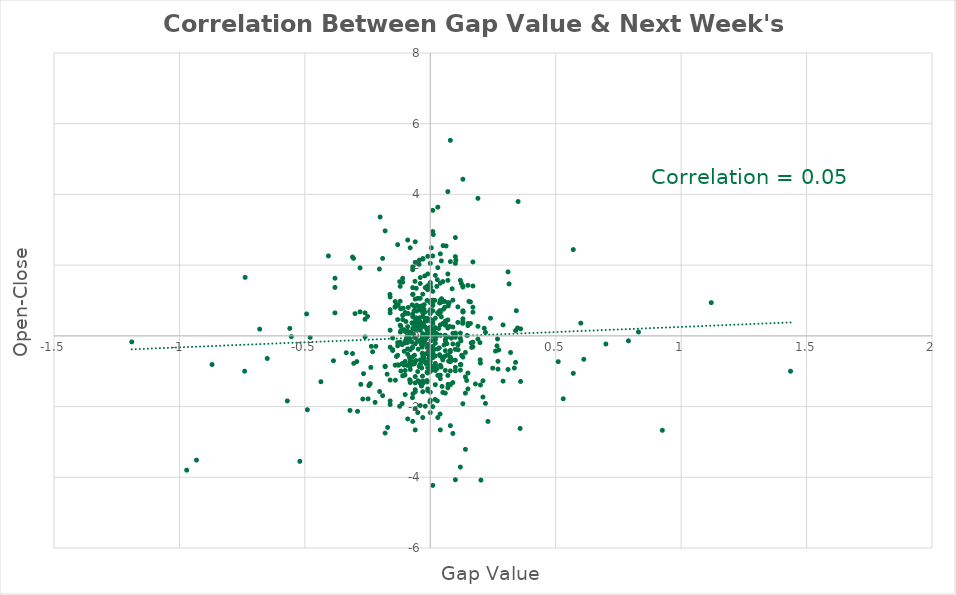
| Category | Series 0 |
|---|---|
| -0.0480000000000018 | -0.377 |
| -0.0409999999999968 | -0.809 |
| -0.0229999999999961 | -0.082 |
| -0.0309999999999917 | -0.235 |
| 0.00499999999999545 | 0.15 |
| -0.0999999999999943 | -0.158 |
| -0.0349999999999965 | -0.226 |
| 0.0289999999999963 | 0.652 |
| -0.00399999999999067 | -0.57 |
| -0.088000000000008 | 0.803 |
| -0.0630000000000023 | -0.548 |
| 0.0240000000000009 | 0.07 |
| -0.0240000000000009 | 0.884 |
| -0.0100000000000051 | -0.243 |
| 0.0369999999999919 | -0.532 |
| -0.0290000000000105 | -0.582 |
| 0.00300000000000011 | -0.136 |
| -0.0390000000000014 | 0.26 |
| -0.034000000000006 | -0.909 |
| -0.0609999999999928 | 0.336 |
| -0.0169999999999959 | -0.786 |
| -0.0649999999999977 | 0.702 |
| 0.0470000000000112 | -1.43 |
| -0.054000000000002 | 0.866 |
| -0.0430000000000063 | 0.833 |
| 0.0570000000000021 | 0.975 |
| 0.0429999999999921 | -0.88 |
| -0.265999999999991 | -1.069 |
| -0.012999999999991 | 0.163 |
| -0.0570000000000021 | -0.699 |
| -0.00100000000000477 | -1.87 |
| -0.0310000000000059 | -1.138 |
| -0.0170000000000101 | -0.504 |
| -0.0580000000000069 | 0.382 |
| 0.054000000000002 | -0.597 |
| 0.027000000000001 | -0.927 |
| -0.066999999999993 | 0.042 |
| -0.0930000000000035 | -0.011 |
| -0.112000000000009 | -0.784 |
| -0.117000000000004 | 0.272 |
| 0.197999999999993 | -0.191 |
| -0.0879999999999938 | 0.633 |
| -0.0769999999999981 | 0.1 |
| -0.0489999999999923 | -0.149 |
| -0.0339999999999918 | -0.272 |
| 0.0720000000000027 | 0.848 |
| -0.0419999999999873 | -1.303 |
| -0.161000000000001 | 1.171 |
| -0.0210000000000008 | -0.014 |
| -0.0219999999999913 | 0.669 |
| 0.129000000000004 | 0.353 |
| -0.0720000000000027 | -0.336 |
| -0.0580000000000069 | 0.163 |
| -0.100999999999999 | -1.109 |
| -0.061000000000007 | 1.542 |
| -0.0120000000000004 | 0.057 |
| -0.11699999999999 | -0.995 |
| -0.0409999999999968 | 0.406 |
| -0.0249999999999914 | 0.754 |
| -0.0670000000000072 | -0.735 |
| -0.11999999999999 | -0.181 |
| -0.105000000000004 | 0.174 |
| 0.0370000000000061 | 0.931 |
| -0.0730000000000075 | -0.179 |
| -0.0429999999999921 | 0.512 |
| -0.149999999999991 | -0.415 |
| -0.103999999999999 | -0.438 |
| -0.0970000000000084 | 0.406 |
| -0.0289999999999963 | 2.186 |
| -0.111999999999994 | -1.914 |
| -0.0600000000000022 | -0.227 |
| -0.0289999999999963 | -0.555 |
| -0.135000000000005 | -0.584 |
| -0.117000000000004 | 0.147 |
| 0.131 | 0.681 |
| -0.0879999999999938 | -0.025 |
| -0.0330000000000012 | 0.85 |
| -0.0150000000000005 | -0.057 |
| -0.293000000000006 | -0.728 |
| 0.0120000000000004 | 2.865 |
| -0.971000000000003 | -3.799 |
| -0.932000000000002 | -3.514 |
| -0.406000000000005 | 2.26 |
| -0.200000000000002 | 3.362 |
| 0.0190000000000054 | -1.8 |
| -0.0959999999999894 | -0.099 |
| 0.0709999999999979 | -1.371 |
| -0.300000000000011 | 0.629 |
| -0.0619999999999976 | 0.818 |
| 0.0480000000000018 | -0.625 |
| -0.201999999999998 | -1.574 |
| -0.0120000000000004 | 1.317 |
| -0.0279999999999915 | -0.007 |
| -0.0910000000000081 | -0.187 |
| 0.0729999999999932 | -0.715 |
| 0.0439999999999969 | 0.957 |
| -0.0439999999999969 | -0.869 |
| 0.01400000000001 | 0.132 |
| -0.0150000000000005 | 0.433 |
| 0.059999999999988 | -0.978 |
| 0.0439999999999969 | 0.539 |
| 0.0660000000000025 | -0.22 |
| -0.0909999999999939 | -0.029 |
| -0.248000000000004 | -1.781 |
| 0.0450000000000017 | 1.05 |
| 0.162999999999996 | -0.199 |
| -0.554000000000002 | -0.023 |
| -0.0800000000000125 | -1.266 |
| -0.236999999999994 | -0.893 |
| -0.435999999999992 | -1.297 |
| -0.128 | 0.868 |
| -0.105000000000004 | -0.829 |
| -0.0720000000000027 | 0.877 |
| -0.0450000000000017 | 2.023 |
| 0.00499999999999545 | -0.967 |
| -0.00200000000000955 | 0.192 |
| -0.0569999999999879 | 0.512 |
| 0.265999999999991 | -0.282 |
| -0.00400000000000488 | -0.614 |
| -0.0690000000000026 | 1.177 |
| 0.268 | -0.088 |
| -0.00900000000000034 | 0.077 |
| -0.0130000000000052 | 1.001 |
| 0.0579999999999927 | 0.812 |
| -0.216999999999998 | -0.297 |
| -0.492999999999995 | 0.62 |
| 0.00399999999999067 | 0.45 |
| -0.0259999999999962 | 0.357 |
| -0.00900000000000034 | 0.089 |
| -0.00900000000000034 | -0.321 |
| 0.198999999999998 | -0.677 |
| 0.121999999999999 | -0.813 |
| 0.0279999999999915 | 1.589 |
| -0.0319999999999964 | -0.319 |
| -0.054000000000002 | 0.702 |
| -0.0130000000000052 | -1.264 |
| -0.0210000000000008 | -0.223 |
| -0.0200000000000102 | -0.741 |
| -0.0160000000000053 | -0.231 |
| -0.007000000000005 | 0.011 |
| -0.118999999999999 | 0.107 |
| -0.0490000000000065 | -1.269 |
| -0.0219999999999913 | -0.05 |
| -0.0220000000000055 | 1.697 |
| -0.279999999999986 | 0.679 |
| -0.0440000000000111 | 2.14 |
| -0.0630000000000023 | -0.787 |
| 0.153999999999996 | 0.973 |
| -0.0829999999999984 | -0.608 |
| -0.0280000000000058 | -0.178 |
| 0.0180000000000006 | 1.002 |
| -0.0240000000000009 | -0.639 |
| -0.012999999999991 | -1.304 |
| 0.0390000000000014 | 0.689 |
| -0.0799999999999982 | -0.394 |
| 0.0699999999999931 | 1.569 |
| 0.0589999999999975 | 0.018 |
| -0.0819999999999936 | -1.241 |
| -0.0319999999999964 | -0.49 |
| -0.0130000000000052 | -1.028 |
| 0.00100000000000477 | 0.051 |
| 0.034000000000006 | 0.207 |
| 0.086999999999989 | -0.68 |
| -0.479000000000013 | -0.044 |
| -0.0600000000000022 | 0.271 |
| -0.0709999999999979 | -0.329 |
| -0.0729999999999932 | 0.369 |
| -0.117999999999995 | 0.766 |
| -0.121999999999999 | -1.993 |
| -0.0900000000000034 | 0.131 |
| -0.12599999999999 | -0.827 |
| 0.0370000000000061 | 0.707 |
| -0.240999999999999 | -1.37 |
| -0.0809999999999888 | -0.089 |
| 0.347999999999999 | 0.223 |
| 0.123999999999995 | 1.483 |
| -0.0350000000000108 | -1.419 |
| 0.0549999999999926 | -0.257 |
| 0.0219999999999913 | 0.007 |
| 0.144999999999996 | -1.261 |
| 0.121999999999999 | -0.143 |
| -0.00600000000000022 | -0.427 |
| -0.081000000000003 | -0.745 |
| -0.0689999999999884 | -1.637 |
| 0.0870000000000033 | 1.332 |
| -0.0440000000000111 | 0.806 |
| -0.276999999999986 | -1.372 |
| 0.314000000000007 | 1.469 |
| 0.00699999999999079 | -0.562 |
| 0.0629999999999881 | 2.542 |
| 0.0259999999999962 | 1.398 |
| 0.0700000000000073 | -1.468 |
| -0.279999999999986 | 1.922 |
| 0.0769999999999981 | 0.266 |
| 0.102000000000003 | 2.14 |
| 0.125 | -0.55 |
| 0.0750000000000028 | 0.934 |
| 0.611999999999994 | -0.663 |
| -0.00500000000000966 | -0.684 |
| 0.0330000000000012 | 0.62 |
| -0.0699999999999931 | 1.365 |
| -0.054000000000002 | 0.477 |
| 0.0359999999999871 | -0.341 |
| 0.359999999999999 | 0.198 |
| -0.0709999999999979 | -1.749 |
| -0.0330000000000012 | 0.757 |
| 0.0840000000000031 | -0.066 |
| 0.165000000000006 | -0.327 |
| 0.249000000000009 | -0.913 |
| 0.357999999999989 | -2.619 |
| -0.737999999999999 | 1.654 |
| -0.171999999999997 | -1.084 |
| 0.147000000000005 | 0.011 |
| -0.0139999999999957 | -0.023 |
| 0.0499999999999971 | 1.536 |
| -0.0330000000000012 | -0.018 |
| -0.0150000000000005 | 0.424 |
| -0.0560000000000116 | 1.345 |
| 0.00100000000000477 | 1.377 |
| -0.268999999999991 | -1.787 |
| -0.138999999999995 | -1.255 |
| 0.0160000000000053 | -0.385 |
| -0.027000000000001 | -0.569 |
| -0.0840000000000031 | 0.02 |
| -0.107999999999989 | 0.784 |
| -0.234999999999999 | -0.297 |
| -0.203000000000003 | 1.89 |
| 0.272999999999996 | -0.399 |
| -0.245000000000004 | -1.408 |
| 1.436 | -1 |
| 0.111000000000004 | -0.394 |
| 0.00399999999999067 | 2.49 |
| -0.0409999999999968 | 0.306 |
| -0.335000000000008 | -0.477 |
| -0.019999999999996 | 1.366 |
| 0.0440000000000111 | 2.12 |
| -0.0910000000000081 | -0.836 |
| 0.0280000000000058 | -1.839 |
| 0.0529999999999972 | 0.758 |
| 0.343000000000003 | 0.712 |
| -0.0999999999999943 | -0.722 |
| -0.305999999999997 | 2.191 |
| -0.304999999999992 | -0.778 |
| -0.111999999999994 | -0.25 |
| 0.0510000000000019 | 2.553 |
| 0.215000000000003 | 0.215 |
| 0.0530000000000114 | 0.355 |
| -0.00300000000000011 | 0.692 |
| 0.0799999999999982 | -2.539 |
| -0.289999999999992 | -2.134 |
| -0.385999999999995 | -0.704 |
| 0.0390000000000014 | -2.21 |
| 0.201999999999998 | -4.079 |
| 0.924999999999997 | -2.671 |
| -0.121999999999999 | 1.534 |
| 0.00900000000000034 | -0.872 |
| 0.129999999999995 | 0.482 |
| 0.335000000000008 | -0.91 |
| 0.0 | -1.592 |
| 0.0100000000000051 | -0.3 |
| -0.0700000000000073 | 1.17 |
| -0.0700000000000073 | 0.35 |
| 0.150000000000005 | 1.43 |
| 0.219999999999998 | -1.91 |
| 0.569999999999993 | -1.06 |
| -0.14 | 0.97 |
| 0.170000000000001 | 0.67 |
| 0.240000000000009 | 0.5 |
| 0.0700000000000073 | 4.08 |
| 0.50999999999999 | -0.73 |
| 0.0100000000000051 | -4.23 |
| 0.170000000000001 | 2.09 |
| -0.740000000000009 | -1 |
| 0.570000000000007 | 2.44 |
| -0.0900000000000034 | 2.71 |
| 0.0300000000000011 | -0.37 |
| 0.189999999999997 | 3.89 |
| 0.0200000000000102 | -0.08 |
| -0.0100000000000051 | -1.5 |
| -0.0099999999999909 | -1.55 |
| -0.0799999999999982 | -0.85 |
| 0.0799999999999982 | 5.53 |
| -0.519999999999996 | -3.55 |
| -0.0699999999999931 | -0.75 |
| 0.0100000000000051 | 3.55 |
| 0.120000000000004 | 1.57 |
| -0.0600000000000022 | -1.58 |
| 0.0400000000000062 | 2.32 |
| 0.120000000000004 | 0.08 |
| -0.0100000000000051 | 0.18 |
| 0.0200000000000102 | -1.38 |
| 0.170000000000001 | 0.81 |
| 0.0300000000000011 | 3.64 |
| 0.129999999999995 | 4.43 |
| -0.0699999999999931 | -2.42 |
| -0.159999999999996 | -1.94 |
| -0.0600000000000022 | 0.18 |
| -0.179999999999992 | 2.97 |
| -0.0999999999999943 | -0.2 |
| 0.0699999999999931 | 0.94 |
| 0.120000000000004 | -0.07 |
| 0.100000000000008 | 2.24 |
| -0.0100000000000051 | -0.28 |
| 0.0999999999999943 | 0.05 |
| -0.310000000000002 | -0.5 |
| 0.129999999999995 | 0.71 |
| -0.179999999999992 | -2.75 |
| 0.0099999999999909 | 0.86 |
| -0.0600000000000022 | -2.06 |
| -0.039999999999992 | 0.73 |
| 0.0899999999999892 | -0.23 |
| -0.0699999999999931 | 0.61 |
| 0.14 | -0.47 |
| -0.0699999999999931 | 0.54 |
| -0.0999999999999943 | -1.66 |
| -0.130000000000009 | 2.58 |
| -0.159999999999996 | 0.16 |
| -0.0100000000000051 | 2.25 |
| -0.0499999999999971 | -0.15 |
| 0.0100000000000051 | -0.32 |
| -0.019999999999996 | -0.1 |
| -0.039999999999992 | 0.23 |
| -0.569999999999993 | -1.84 |
| -0.870000000000004 | -0.81 |
| -1.18999999999999 | -0.17 |
| 0.269999999999996 | -0.94 |
| -0.260000000000005 | 0.47 |
| -0.0300000000000011 | 2.17 |
| -0.0600000000000022 | -1.52 |
| -0.0600000000000022 | -2.66 |
| 0.0 | -2.17 |
| -0.120000000000004 | 0.3 |
| 0.0 | 0.42 |
| -0.0600000000000022 | -1.33 |
| 0.0900000000000034 | 0.07 |
| 0.129999999999995 | 1.41 |
| -0.0799999999999982 | -1.32 |
| 0.0899999999999892 | 0.25 |
| -0.159999999999996 | 0.74 |
| 0.0 | 1.38 |
| 0.039999999999992 | -0.57 |
| 0.0300000000000011 | -1.12 |
| 0.059999999999988 | -0.57 |
| -0.230000000000004 | -0.45 |
| -0.0900000000000034 | 0.26 |
| -0.490000000000009 | -2.09 |
| -0.25999999999999 | -0.03 |
| -0.159999999999996 | -0.32 |
| -0.25999999999999 | 0.65 |
| 0.0999999999999943 | 2.05 |
| -0.0300000000000011 | -0.14 |
| 0.0400000000000062 | -0.83 |
| -0.14 | -0.83 |
| 0.0999999999999943 | 2.78 |
| 0.0900000000000034 | -2.76 |
| 0.0800000000000125 | -0.73 |
| 0.179999999999992 | -1.36 |
| -0.219999999999998 | -1.88 |
| 0.530000000000001 | -1.78 |
| 0.0999999999999943 | -4.07 |
| 0.310000000000002 | -0.95 |
| -0.0999999999999943 | 0.66 |
| -0.0600000000000022 | 2.08 |
| 0.0100000000000051 | -0.5 |
| 0.019999999999996 | -0.21 |
| -0.159999999999996 | -1.84 |
| -0.0300000000000011 | -2.31 |
| 0.0999999999999943 | -0.89 |
| 0.339999999999989 | 0.15 |
| -0.0300000000000011 | -1.58 |
| 0.170000000000001 | -0.18 |
| -0.0299999999999869 | 0.54 |
| -0.0700000000000073 | -0.8 |
| 0.0099999999999909 | -0.49 |
| 0.0300000000000011 | 0.02 |
| 0.0 | 0.74 |
| -0.0400000000000062 | -0.68 |
| 0.0400000000000062 | 0.66 |
| 0.0099999999999909 | 0 |
| 0.0 | 0.46 |
| 0.0799999999999982 | -0.65 |
| 0.0100000000000051 | 0.18 |
| 0.0 | -0.43 |
| 0.0499999999999971 | 0.35 |
| -0.0300000000000011 | 0.36 |
| -0.0100000000000051 | -0.01 |
| 0.0200000000000102 | 0.23 |
| 0.019999999999996 | -0.78 |
| -0.039999999999992 | 1.65 |
| 0.100000000000008 | -0.38 |
| 0.019999999999996 | -0.57 |
| 0.019999999999996 | -0.87 |
| -0.0700000000000073 | 1.87 |
| -0.189999999999997 | -1.69 |
| 0.0099999999999909 | 0.71 |
| -0.130000000000009 | -0.82 |
| 0.129999999999995 | 0.68 |
| -0.0900000000000034 | -0.37 |
| -0.0999999999999943 | 0.12 |
| -0.0699999999999931 | 1.95 |
| -0.130000000000009 | -0.28 |
| 0.0 | 0.68 |
| 0.0100000000000051 | 0.35 |
| -0.0600000000000022 | -1.15 |
| 0.019999999999996 | -0.83 |
| 0.109999999999999 | -0.23 |
| 0.0799999999999982 | -0.41 |
| 0.0400000000000062 | -1.11 |
| 0.100000000000008 | -0.99 |
| 0.120000000000004 | -0.97 |
| 0.170000000000001 | -0.31 |
| 0.150000000000005 | -1.05 |
| 0.0700000000000073 | 0.45 |
| -0.25 | 0.55 |
| -0.239999999999994 | -1.35 |
| -0.560000000000002 | 0.21 |
| -0.120000000000004 | 0.98 |
| -0.650000000000005 | -0.64 |
| 0.600000000000008 | 0.36 |
| 0.269999999999996 | -0.72 |
| -0.130000000000009 | 0.46 |
| 0.0699999999999931 | -1.12 |
| 0.14 | -1.16 |
| -0.0600000000000022 | 2.66 |
| -0.180000000000006 | -0.86 |
| -0.189999999999997 | 2.19 |
| 0.209999999999993 | -1.27 |
| 0.0799999999999982 | 2.1 |
| 0.129999999999995 | -1.92 |
| 0.039999999999992 | -1.21 |
| 0.11999999999999 | -3.71 |
| 0.350000000000008 | 3.8 |
| 0.0099999999999909 | 2.95 |
| -0.0999999999999943 | 0.63 |
| -0.379999999999995 | 1.63 |
| 0.290000000000006 | -1.28 |
| 0.230000000000004 | -2.42 |
| -0.0499999999999971 | -1.01 |
| 0.310000000000002 | 1.81 |
| -0.16000000000001 | -1.25 |
| 0.700000000000002 | -0.23 |
| 0.14 | -3.21 |
| 0.109999999999999 | 0.38 |
| -0.680000000000006 | 0.19 |
| 0.039999999999992 | 0.71 |
| 0.0300000000000011 | -2.31 |
| 1.12 | 0.94 |
| 0.190000000000011 | 0.27 |
| 0.200000000000002 | -0.77 |
| 0.0 | 0.24 |
| 0.210000000000008 | -1.73 |
| 0.0 | -0.73 |
| 0.120000000000004 | -0.81 |
| -0.0100000000000051 | -1.05 |
| -0.0900000000000034 | -2.35 |
| 0.150000000000005 | -1.5 |
| 0.829999999999998 | 0.11 |
| 0.0200000000000102 | -0.98 |
| -0.0899999999999892 | -0.12 |
| -0.0400000000000062 | -0.13 |
| 0.0799999999999982 | -0.99 |
| 0.0 | -1.82 |
| 0.0400000000000062 | 0.95 |
| -0.0400000000000062 | -0.81 |
| 0.0 | -0.35 |
| 0.0 | -0.83 |
| -0.0100000000000051 | 0.2 |
| 0.0499999999999971 | -0.68 |
| 0.019999999999996 | 0.22 |
| -0.0499999999999971 | 0.21 |
| 0.059999999999988 | -0.14 |
| -0.039999999999992 | 0.16 |
| 0.039999999999992 | 0.31 |
| 0.0099999999999909 | 0.9 |
| -0.039999999999992 | -1.34 |
| 0.159999999999996 | 0.35 |
| 0.019999999999996 | 0.02 |
| -0.019999999999996 | 0 |
| 0.109999999999999 | 0.82 |
| -0.019999999999996 | 0.45 |
| 0.0699999999999931 | 0.22 |
| 0.0 | 0.63 |
| 0.14 | -1.62 |
| 0.159999999999996 | 0.96 |
| 0.0799999999999982 | -1.38 |
| 0.019999999999996 | 1.71 |
| 0.0799999999999982 | -0.6 |
| 0.0499999999999971 | 0.97 |
| -0.0200000000000102 | -0.1 |
| 0.0100000000000051 | 0.42 |
| 0.0100000000000051 | 1.26 |
| -0.0799999999999982 | -0.66 |
| -0.109999999999999 | 0.58 |
| 0.170000000000001 | 1.41 |
| 0.0800000000000125 | -0.45 |
| -0.0500000000000113 | 1.06 |
| 0.019999999999996 | -0.94 |
| -0.0300000000000011 | -0.71 |
| 0.0699999999999931 | -0.54 |
| 0.0499999999999971 | -1.6 |
| -0.039999999999992 | -1.97 |
| 0.0 | -1.01 |
| -0.0300000000000011 | 0.06 |
| -0.0300000000000011 | 0.27 |
| 0.100000000000008 | 0.08 |
| -0.059999999999988 | -0.06 |
| 0.0700000000000073 | -0.03 |
| -0.0299999999999869 | 1.18 |
| 0.0 | -0.31 |
| 0.0600000000000022 | -0.1 |
| 0.0600000000000022 | 0.42 |
| -0.150000000000005 | -0.39 |
| 0.0099999999999909 | -0.87 |
| 0.129999999999995 | 0.41 |
| -0.039999999999992 | 1.06 |
| -0.170000000000001 | -2.59 |
| -0.0600000000000022 | 0.39 |
| -0.14 | 0.81 |
| 0.0600000000000022 | -0.42 |
| 0.0600000000000022 | 0.33 |
| -0.129999999999995 | -0.55 |
| 0.150000000000005 | 0.35 |
| -0.159999999999996 | 0.65 |
| 0.0999999999999943 | -0.69 |
| 0.0999999999999943 | -0.04 |
| 0.219999999999998 | 0.1 |
| 0.149999999999991 | 0.29 |
| -0.379999999999995 | 1.37 |
| 0.359999999999999 | -1.29 |
| -0.0100000000000051 | 1.75 |
| -0.0300000000000011 | 0.55 |
| -0.0100000000000051 | 1.42 |
| -0.019999999999996 | 0.25 |
| -0.0899999999999892 | -0.52 |
| 0.109999999999999 | -0.26 |
| -0.0600000000000022 | 0.23 |
| -0.0300000000000011 | -0.09 |
| -0.0200000000000102 | 0.5 |
| 0.0899999999999892 | 1.01 |
| 0.120000000000004 | -0.82 |
| 0.019999999999996 | -0.11 |
| -0.0600000000000022 | 0.49 |
| -0.0300000000000011 | 0.65 |
| 0.129999999999995 | 1.38 |
| 0.0700000000000073 | 1.75 |
| 0.129999999999995 | -0.6 |
| 0.039999999999992 | -2.66 |
| 0.320000000000007 | -0.47 |
| -0.159999999999996 | 1.1 |
| 0.019999999999996 | 0.5 |
| 0.0100000000000051 | -0.62 |
| -0.120000000000004 | 1.4 |
| 0.0600000000000022 | 0.3 |
| -0.0300000000000011 | -1.28 |
| -0.129999999999995 | -0.19 |
| -0.0600000000000022 | 0.39 |
| -0.0700000000000073 | 0.21 |
| 0.0600000000000022 | 0.35 |
| 0.0099999999999909 | -2 |
| -0.109999999999999 | 1.63 |
| -0.059999999999988 | 1.04 |
| 0.0400000000000062 | 0.02 |
| 0.0900000000000034 | -1.32 |
| -0.039999999999992 | 1.48 |
| -0.0700000000000073 | -0.59 |
| -0.109999999999999 | -1.13 |
| -0.0300000000000011 | -1.3 |
| -0.0799999999999982 | -0.95 |
| -0.129999999999995 | 0.88 |
| -0.0300000000000011 | -0.01 |
| -0.0100000000000051 | 0.49 |
| -0.0100000000000051 | 1.31 |
| 0.0100000000000051 | 1 |
| -0.109999999999999 | 1.52 |
| 0.0600000000000022 | -1.62 |
| -0.150000000000005 | -0.06 |
| 0.0400000000000062 | 1.01 |
| -0.0499999999999971 | 0.34 |
| -0.110000000000013 | 0.46 |
| -0.179999999999992 | -0.87 |
| -0.14 | 0.83 |
| 0.0 | 0.99 |
| -0.0100000000000051 | -0.9 |
| 0.0 | 2.05 |
| -0.100000000000008 | -0.98 |
| 0.0 | 1.51 |
| 0.0 | 1.46 |
| 0.0 | 0.94 |
| 0.0 | 0.24 |
| 0.0 | -0.83 |
| 0.340000000000003 | -0.75 |
| -0.310000000000002 | 2.23 |
| 0.790000000000006 | -0.14 |
| 0.0100000000000051 | 2.26 |
| 0.0 | 0.13 |
| -0.319999999999993 | -2.11 |
| 0.0100000000000051 | 1.01 |
| 0.0400000000000062 | 1.49 |
| -0.0499999999999971 | -2.17 |
| -0.019999999999996 | -1.99 |
| 0.289999999999992 | 0.31 |
| 0.189999999999997 | -0.09 |
| -0.0300000000000011 | -1.35 |
| -0.0799999999999982 | 2.49 |
| 0.200000000000002 | -1.39 |
| 0.25999999999999 | -0.43 |
| -0.380000000000009 | 0.65 |
| 0.0 | -0.45 |
| 0.0 | 0.94 |
| 0.0300000000000011 | 1.93 |